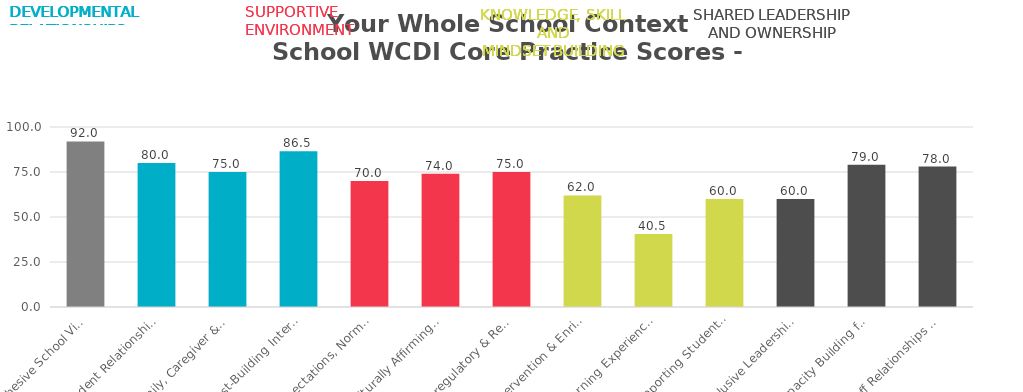
| Category | Series 0 |
|---|---|
| Cohesive School Vision | 92 |
| Student Relationship Structures | 80 |
| Family, Caregiver & Community Partnerships | 75 |
| Trust-Building Interactions  | 86.5 |
| Expectations, Norms & Routines | 70 |
| Culturally Affirming & Sustaining Practices  | 74 |
| Co-regulatory & Restorative Practices | 75 |
| Intervention & Enrichment Structures  | 62 |
| Learning Experiences in Zone of Proximal Development  | 40.5 |
| Supporting Student Agency | 60 |
| Inclusive Leadership  | 60 |
| Capacity Building for Whole Child Development  | 79 |
| Staff Relationships and Collaboration | 78 |